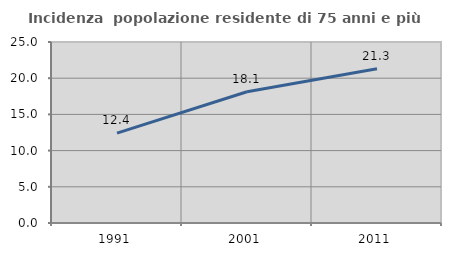
| Category | Incidenza  popolazione residente di 75 anni e più |
|---|---|
| 1991.0 | 12.409 |
| 2001.0 | 18.13 |
| 2011.0 | 21.303 |